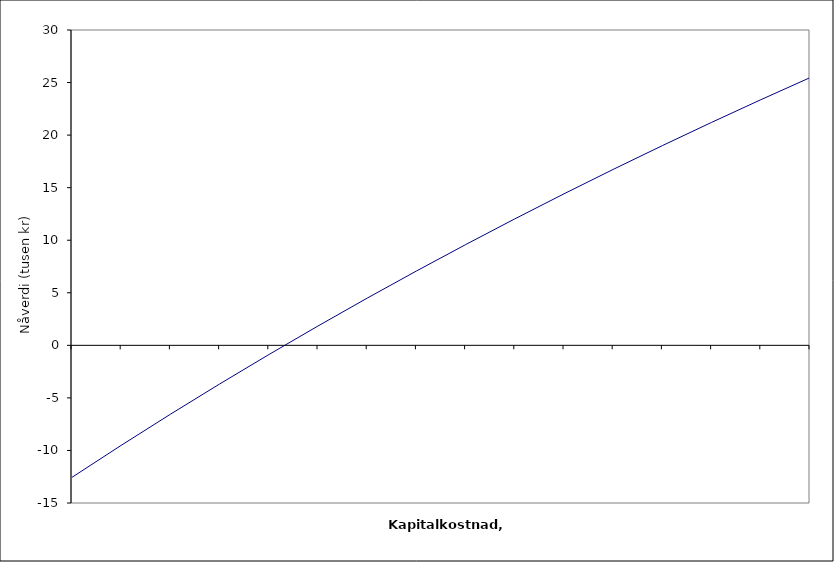
| Category | Series 0 |
|---|---|
| nan | -12.556 |
| 1.0 | -9.514 |
| 2.0 | -6.556 |
| 3.0 | -3.68 |
| 4.0 | -0.882 |
| 5.0 | 1.841 |
| 6.0 | 4.49 |
| 7.0 | 7.07 |
| 8.0 | 9.582 |
| 9.0 | 12.03 |
| 10.0 | 14.414 |
| 11.0 | 16.738 |
| 12.0 | 19.003 |
| 13.0 | 21.211 |
| 14.0 | 23.365 |
| 15.0 | 25.466 |